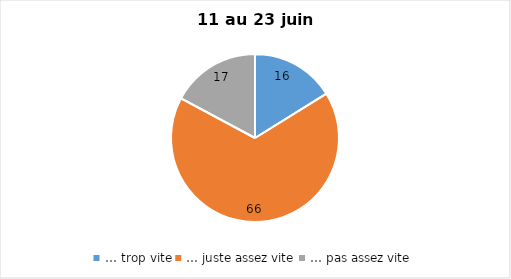
| Category | Series 0 |
|---|---|
| … trop vite | 16 |
| … juste assez vite | 66 |
| … pas assez vite | 17 |